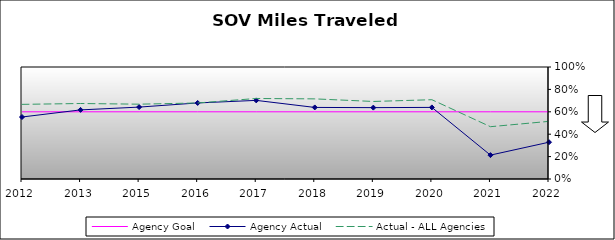
| Category | Agency Goal | Agency Actual | Actual - ALL Agencies |
|---|---|---|---|
| 2012.0 | 0.6 | 0.554 | 0.666 |
| 2013.0 | 0.6 | 0.617 | 0.674 |
| 2015.0 | 0.6 | 0.642 | 0.668 |
| 2016.0 | 0.6 | 0.679 | 0.679 |
| 2017.0 | 0.6 | 0.702 | 0.719 |
| 2018.0 | 0.6 | 0.639 | 0.715 |
| 2019.0 | 0.6 | 0.637 | 0.692 |
| 2020.0 | 0.6 | 0.639 | 0.708 |
| 2021.0 | 0.6 | 0.213 | 0.467 |
| 2022.0 | 0.6 | 0.328 | 0.515 |